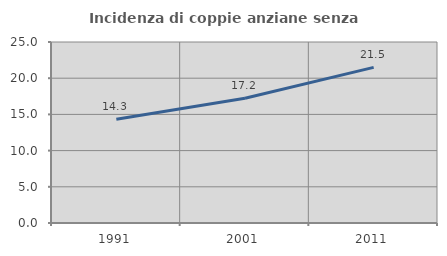
| Category | Incidenza di coppie anziane senza figli  |
|---|---|
| 1991.0 | 14.319 |
| 2001.0 | 17.237 |
| 2011.0 | 21.492 |